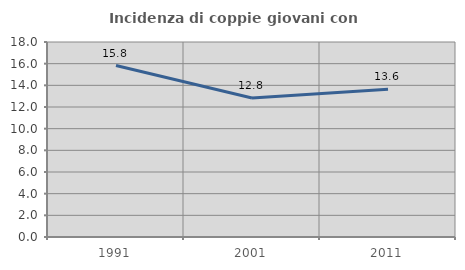
| Category | Incidenza di coppie giovani con figli |
|---|---|
| 1991.0 | 15.827 |
| 2001.0 | 12.838 |
| 2011.0 | 13.636 |